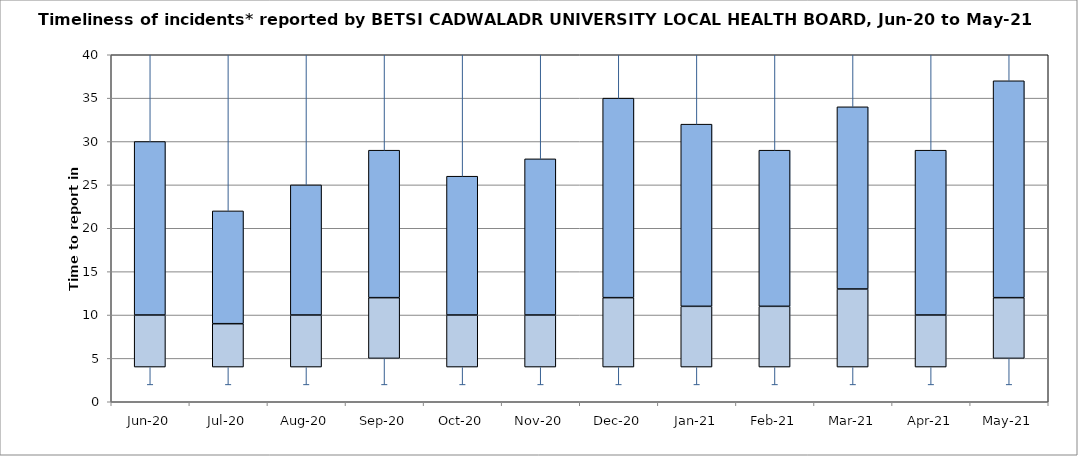
| Category | Series 0 | Series 1 | Series 2 |
|---|---|---|---|
| Jun-20 | 4 | 6 | 20 |
| Jul-20 | 4 | 5 | 13 |
| Aug-20 | 4 | 6 | 15 |
| Sep-20 | 5 | 7 | 17 |
| Oct-20 | 4 | 6 | 16 |
| Nov-20 | 4 | 6 | 18 |
| Dec-20 | 4 | 8 | 23 |
| Jan-21 | 4 | 7 | 21 |
| Feb-21 | 4 | 7 | 18 |
| Mar-21 | 4 | 9 | 21 |
| Apr-21 | 4 | 6 | 19 |
| May-21 | 5 | 7 | 25 |